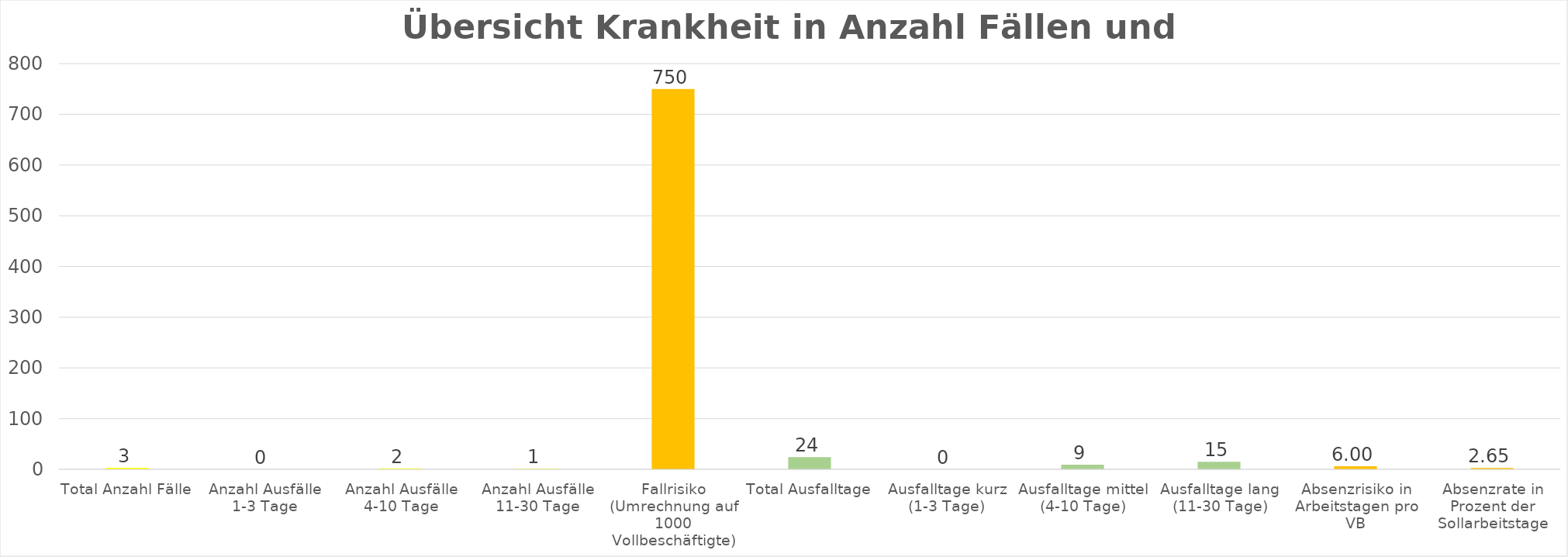
| Category | Krankheit  |
|---|---|
| Total Anzahl Fälle | 3 |
| Anzahl Ausfälle 1-3 Tage | 0 |
| Anzahl Ausfälle 4-10 Tage | 2 |
| Anzahl Ausfälle 11-30 Tage | 1 |
| Fallrisiko (Umrechnung auf 1000 Vollbeschäftigte) | 750 |
| Total Ausfalltage | 24 |
| Ausfalltage kurz (1-3 Tage) | 0 |
| Ausfalltage mittel (4-10 Tage) | 9 |
| Ausfalltage lang (11-30 Tage) | 15 |
| Absenzrisiko in Arbeitstagen pro VB | 6 |
| Absenzrate in Prozent der Sollarbeitstage | 2.655 |